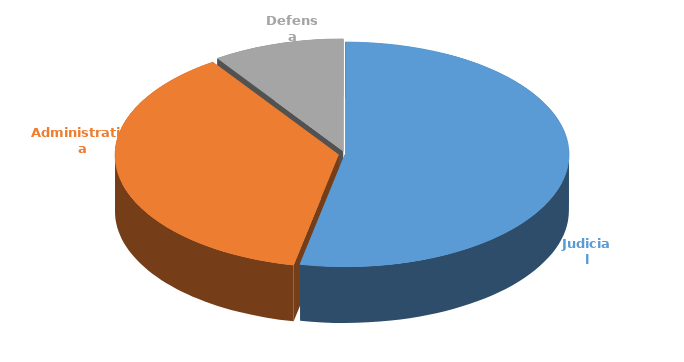
| Category | Cantidad |
|---|---|
| Judicial | 330 |
| Administrativa | 231 |
| Defensa | 59 |